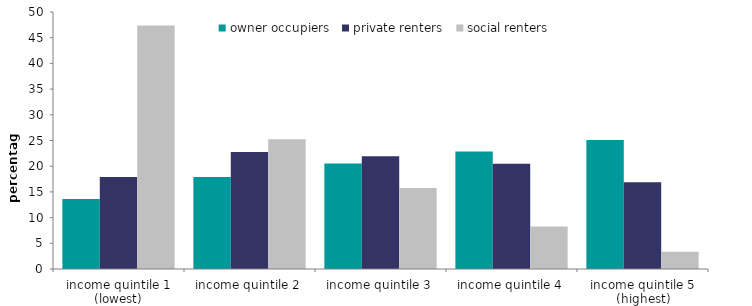
| Category | owner occupiers | private renters | social renters |
|---|---|---|---|
| income quintile 1 (lowest) | 13.617 | 17.918 | 47.395 |
| income quintile 2 | 17.888 | 22.77 | 25.262 |
| income quintile 3 | 20.529 | 21.94 | 15.749 |
| income quintile 4 | 22.849 | 20.493 | 8.262 |
| income quintile 5 (highest) | 25.118 | 16.879 | 3.333 |